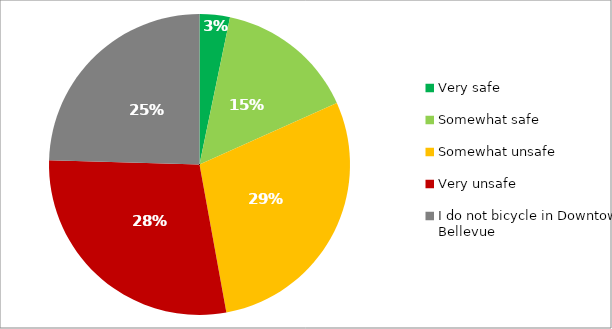
| Category | Responses |
|---|---|
| Very safe | 0.033 |
| Somewhat safe | 0.15 |
| Somewhat unsafe | 0.288 |
| Very unsafe | 0.283 |
| I do not bicycle in Downtown Bellevue | 0.245 |